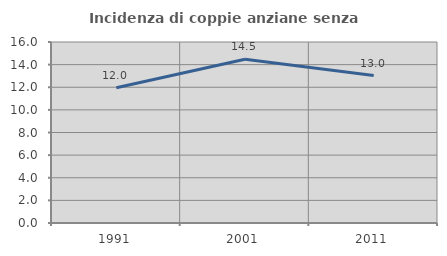
| Category | Incidenza di coppie anziane senza figli  |
|---|---|
| 1991.0 | 11.959 |
| 2001.0 | 14.483 |
| 2011.0 | 13.029 |